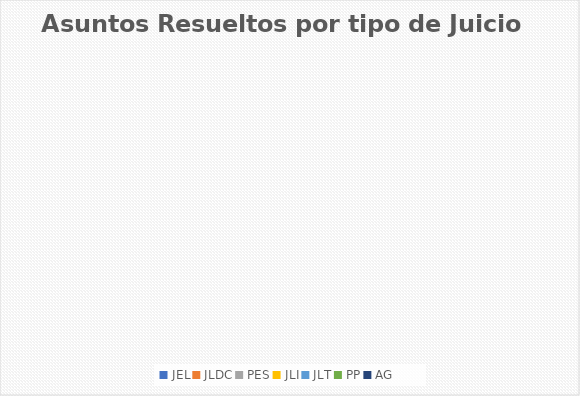
| Category | Asuntos Resueltos por tipo de Juicio  Julio |
|---|---|
| JEL | 0 |
| JLDC | 0 |
| PES | 0 |
| JLI | 0 |
| JLT | 0 |
| PP | 0 |
| AG | 0 |